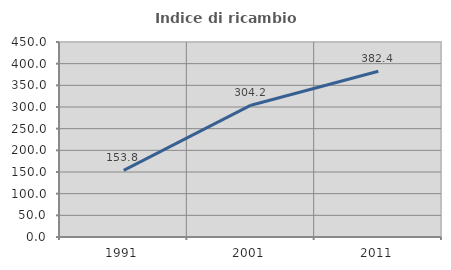
| Category | Indice di ricambio occupazionale  |
|---|---|
| 1991.0 | 153.846 |
| 2001.0 | 304.167 |
| 2011.0 | 382.353 |